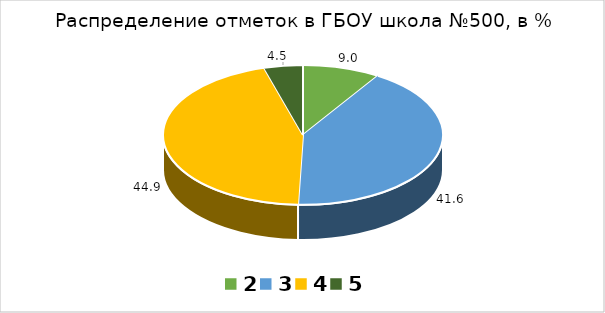
| Category | ГБОУ СОШ №500 |
|---|---|
| 2.0 | 8.99 |
| 3.0 | 41.57 |
| 4.0 | 44.94 |
| 5.0 | 4.49 |